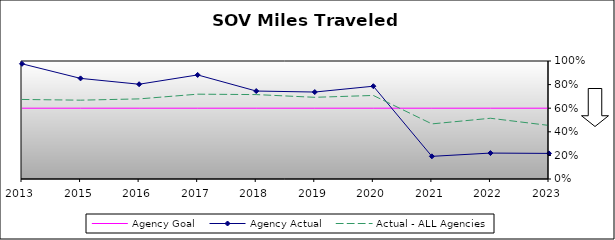
| Category | Agency Goal | Agency Actual | Actual - ALL Agencies |
|---|---|---|---|
| 2013.0 | 0.6 | 0.976 | 0.674 |
| 2015.0 | 0.6 | 0.853 | 0.668 |
| 2016.0 | 0.6 | 0.803 | 0.679 |
| 2017.0 | 0.6 | 0.882 | 0.719 |
| 2018.0 | 0.6 | 0.745 | 0.715 |
| 2019.0 | 0.6 | 0.737 | 0.692 |
| 2020.0 | 0.6 | 0.786 | 0.708 |
| 2021.0 | 0.6 | 0.192 | 0.467 |
| 2022.0 | 0.6 | 0.22 | 0.515 |
| 2023.0 | 0.6 | 0.217 | 0.454 |